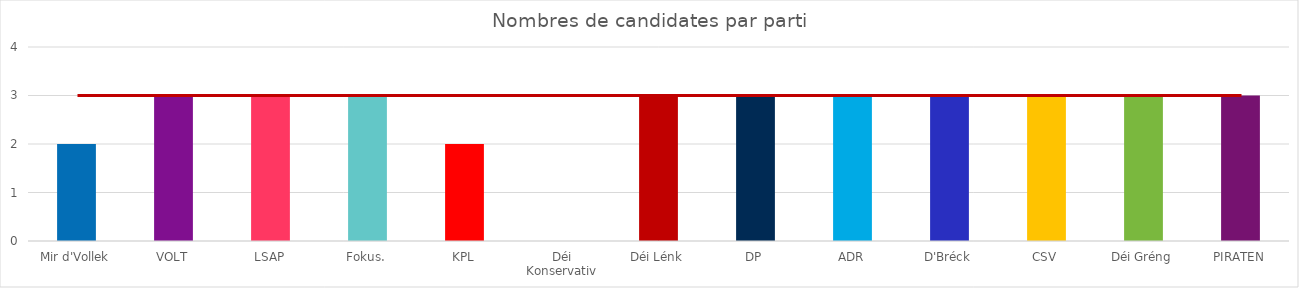
| Category | Femmes |
|---|---|
| Mir d'Vollek | 2 |
| VOLT | 3 |
| LSAP | 3 |
| Fokus. | 3 |
| KPL | 2 |
| Déi Konservativ | 0 |
| Déi Lénk | 3 |
| DP | 3 |
| ADR | 3 |
| D'Bréck | 3 |
| CSV | 3 |
| Déi Gréng | 3 |
| PIRATEN | 3 |